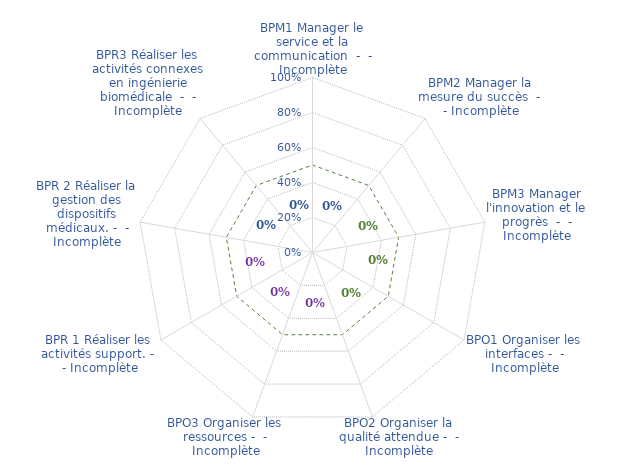
| Category | Toutes les Bonnes Pratiques | Limite d'Autodéclaration ISO 17050 |
|---|---|---|
| BPM1 Manager le service et la communication  -  - Incomplète | 0 | 0.5 |
| BPM2 Manager la mesure du succès  -  - Incomplète | 0 | 0.5 |
| BPM3 Manager l'innovation et le progrès  -  - Incomplète | 0 | 0.5 |
| BPO1 Organiser les interfaces -  - Incomplète | 0 | 0.5 |
| BPO2 Organiser la qualité attendue -  - Incomplète | 0 | 0.5 |
| BPO3 Organiser les ressources -  - Incomplète | 0 | 0.5 |
| BPR 1 Réaliser les activités support. -  - Incomplète | 0 | 0.5 |
| BPR 2 Réaliser la gestion des dispositifs médicaux. -  - Incomplète | 0 | 0.5 |
| BPR3 Réaliser les activités connexes en ingénierie biomédicale  -  - Incomplète | 0 | 0.5 |